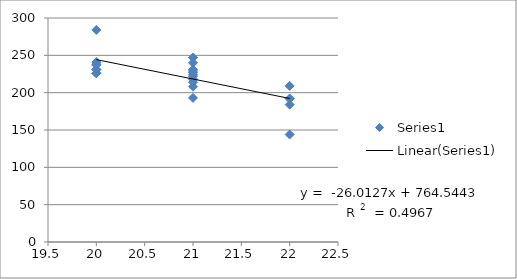
| Category | Series 0 |
|---|---|
| 21.0 | 227 |
| 22.0 | 192 |
| 20.0 | 238 |
| 21.0 | 247 |
| 21.0 | 224 |
| 22.0 | 144 |
| 20.0 | 231 |
| 20.0 | 231 |
| 22.0 | 192 |
| 21.0 | 214 |
| 20.0 | 226 |
| 21.0 | 231 |
| 21.0 | 240 |
| 21.0 | 193 |
| 20.0 | 226 |
| 21.0 | 247 |
| 22.0 | 209 |
| 20.0 | 284 |
| 21.0 | 222 |
| 20.0 | 241 |
| 20.0 | 237 |
| 22.0 | 184 |
| 21.0 | 218 |
| 21.0 | 229 |
| 21.0 | 208 |